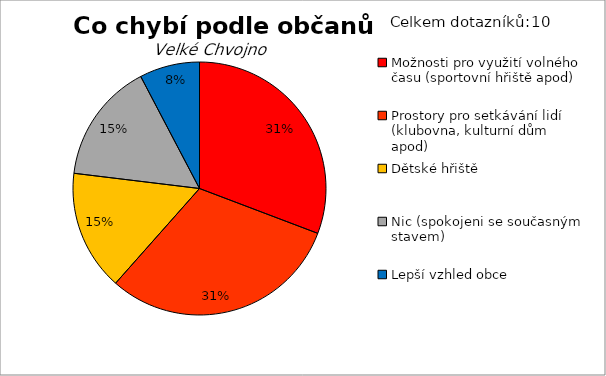
| Category | Series 0 |
|---|---|
| Možnosti pro využití volného času (sportovní hřiště apod) | 4 |
| Prostory pro setkávání lidí (klubovna, kulturní dům apod) | 4 |
| Dětské hřiště | 2 |
| Nic (spokojeni se současným stavem) | 2 |
| Lepší vzhled obce | 1 |